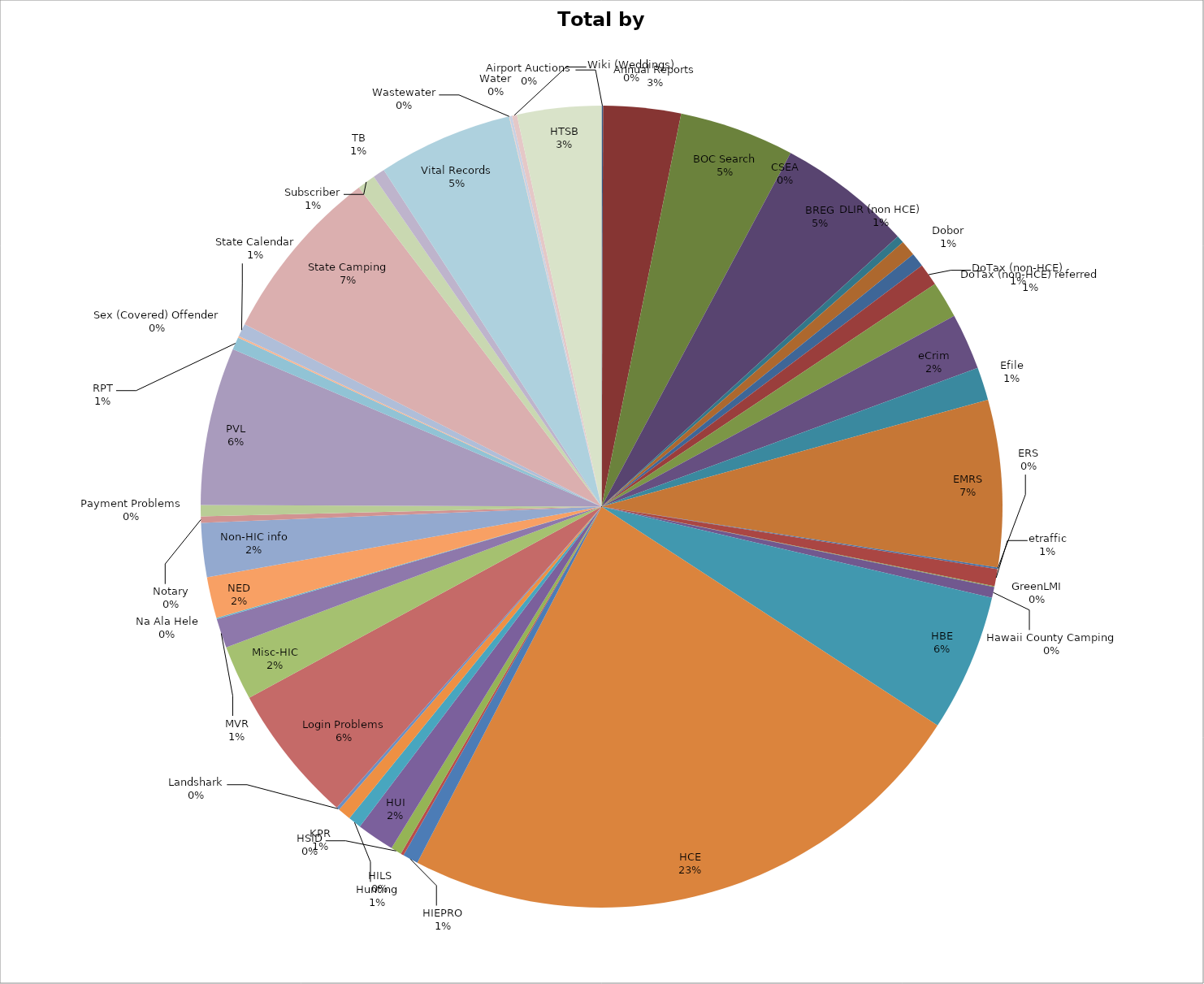
| Category | Series 0 |
|---|---|
| Airport Auctions | 18 |
| Annual Reports | 929 |
| BOC Search | 1378 |
| BREG | 1612 |
| CSEA | 91 |
| DLIR (non HCE) | 188 |
| Dobor | 168 |
| DoTax (non-HCE) | 267 |
| DoTax (non-HCE) referred | 439 |
| eCrim | 675 |
| Efile | 396 |
| EMRS | 2001 |
| ERS | 19 |
| etraffic | 204 |
| GreenLMI | 11 |
| Hawaii County Camping | 130 |
| HBE | 1647 |
| HCE | 6967 |
| HIEPRO | 186 |
| HILS | 36 |
| HSID | 128 |
| HUI | 454 |
| Hunting | 156 |
| KPR | 159 |
| Landshark | 36 |
| Login Problems | 1668 |
| Misc-HIC | 655 |
| MVR | 352 |
| Na Ala Hele | 14 |
| NED | 494 |
| Non-HIC info | 648 |
| Notary | 75 |
| Payment Problems | 136 |
| PVL | 1891 |
| RPT | 150 |
| Sex (Covered) Offender | 20 |
| State Calendar | 156 |
| State Camping | 2123 |
| Subscriber | 217 |
| TB | 142 |
| Vital Records | 1616 |
| Wastewater | 6 |
| Water | 29 |
| Wiki (Weddings) | 61 |
| HTSB | 1008 |